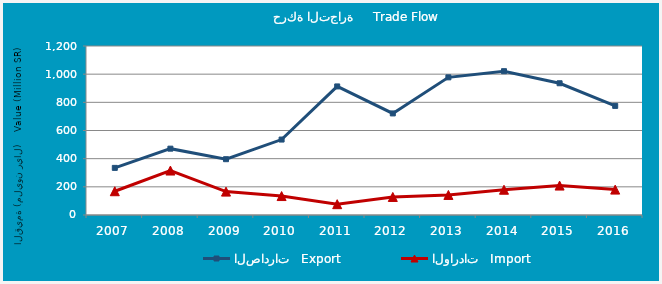
| Category | الصادرات   Export | الواردات   Import |
|---|---|---|
| 2007.0 | 334.561 | 168.828 |
| 2008.0 | 471.04 | 315.658 |
| 2009.0 | 396.212 | 166.037 |
| 2010.0 | 535.695 | 134.496 |
| 2011.0 | 912.948 | 76.872 |
| 2012.0 | 721.238 | 128.092 |
| 2013.0 | 977.43 | 142.451 |
| 2014.0 | 1021.172 | 179.459 |
| 2015.0 | 935.493 | 208.952 |
| 2016.0 | 774.687 | 180.337 |